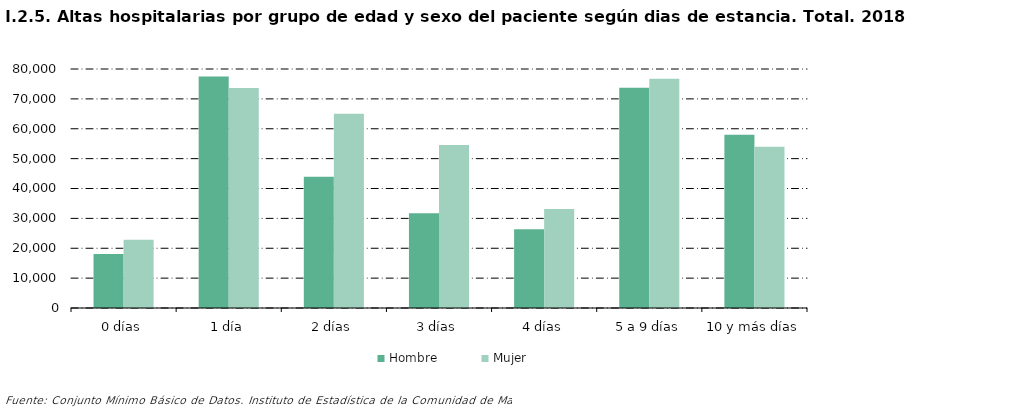
| Category |     Hombre |     Mujer |
|---|---|---|
| 0 | 18093 | 22874 |
| 1 | 77495 | 73612 |
| 2 | 43918 | 65025 |
| 3 | 31755 | 54526 |
| 4 | 26319 | 33124 |
| 5 | 73691 | 76777 |
| 6 | 58008 | 54005 |